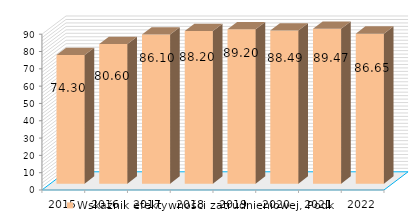
| Category | Wskaźnik efektywności zatrudnieniowej, Podkarpackie |
|---|---|
| 2015.0 | 74.3 |
| 2016.0 | 80.6 |
| 2017.0 | 86.1 |
| 2018.0 | 88.2 |
| 2019.0 | 89.2 |
| 2020.0 | 88.495 |
| 2021.0 | 89.471 |
| 2022.0 | 86.647 |